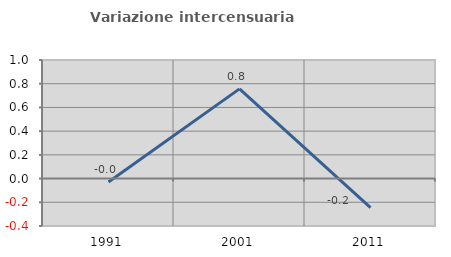
| Category | Variazione intercensuaria annua |
|---|---|
| 1991.0 | -0.029 |
| 2001.0 | 0.756 |
| 2011.0 | -0.245 |